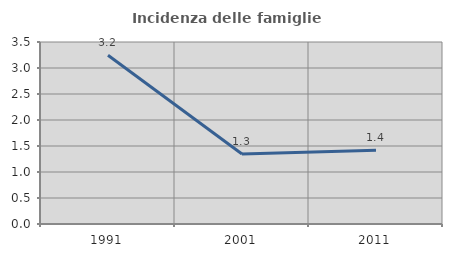
| Category | Incidenza delle famiglie numerose |
|---|---|
| 1991.0 | 3.247 |
| 2001.0 | 1.346 |
| 2011.0 | 1.417 |